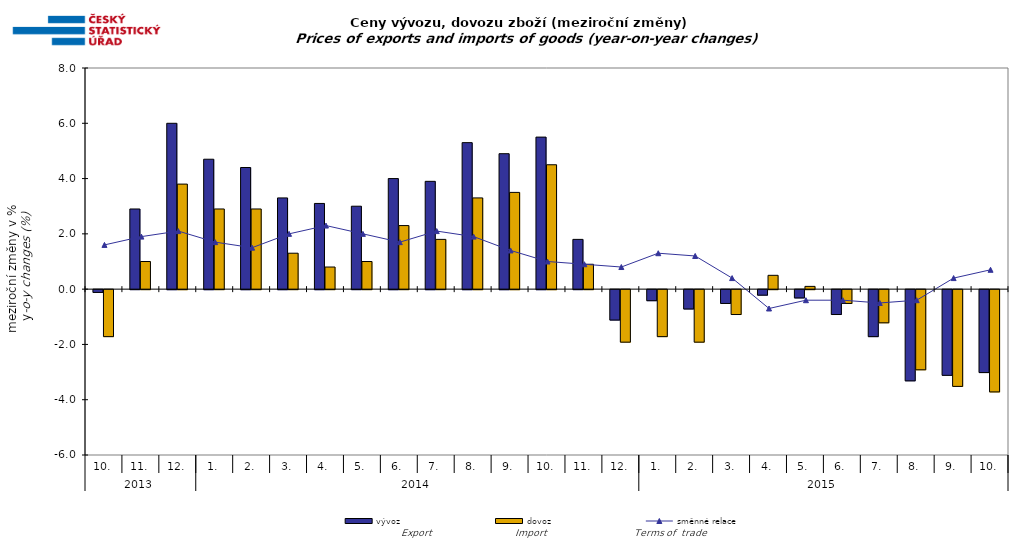
| Category | vývoz | dovoz |
|---|---|---|
| 0 | -0.1 | -1.7 |
| 1 | 2.9 | 1 |
| 2 | 6 | 3.8 |
| 3 | 4.7 | 2.9 |
| 4 | 4.4 | 2.9 |
| 5 | 3.3 | 1.3 |
| 6 | 3.1 | 0.8 |
| 7 | 3 | 1 |
| 8 | 4 | 2.3 |
| 9 | 3.9 | 1.8 |
| 10 | 5.3 | 3.3 |
| 11 | 4.9 | 3.5 |
| 12 | 5.5 | 4.5 |
| 13 | 1.8 | 0.9 |
| 14 | -1.1 | -1.9 |
| 15 | -0.4 | -1.7 |
| 16 | -0.7 | -1.9 |
| 17 | -0.5 | -0.9 |
| 18 | -0.2 | 0.5 |
| 19 | -0.3 | 0.1 |
| 20 | -0.9 | -0.5 |
| 21 | -1.7 | -1.2 |
| 22 | -3.3 | -2.9 |
| 23 | -3.1 | -3.5 |
| 24 | -3 | -3.7 |